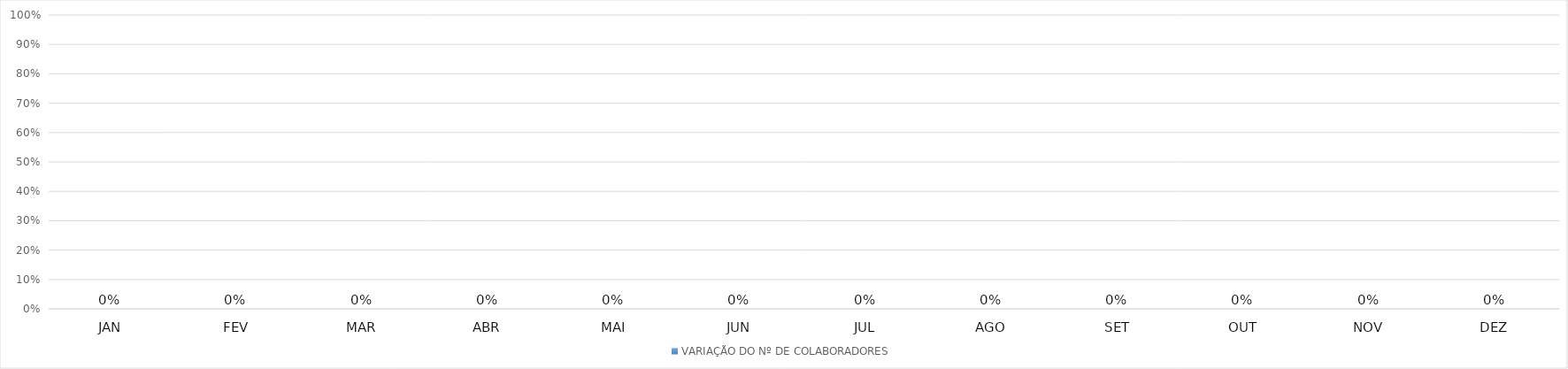
| Category | VARIAÇÃO DO Nº DE COLABORADORES |
|---|---|
| JAN | 0 |
| FEV | 0 |
| MAR | 0 |
| ABR | 0 |
| MAI | 0 |
| JUN | 0 |
| JUL | 0 |
| AGO | 0 |
| SET | 0 |
| OUT | 0 |
| NOV | 0 |
| DEZ | 0 |